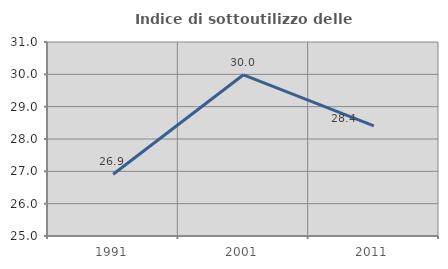
| Category | Indice di sottoutilizzo delle abitazioni  |
|---|---|
| 1991.0 | 26.912 |
| 2001.0 | 29.986 |
| 2011.0 | 28.404 |